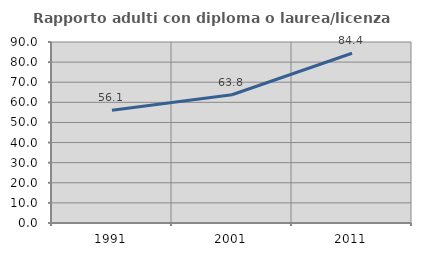
| Category | Rapporto adulti con diploma o laurea/licenza media  |
|---|---|
| 1991.0 | 56.087 |
| 2001.0 | 63.751 |
| 2011.0 | 84.396 |